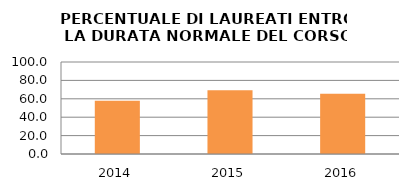
| Category | 2014 2015 2016 |
|---|---|
| 2014.0 | 57.831 |
| 2015.0 | 69.355 |
| 2016.0 | 65.455 |